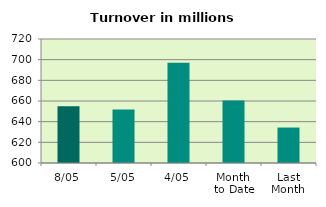
| Category | Series 0 |
|---|---|
| 8/05 | 654.845 |
| 5/05 | 651.89 |
| 4/05 | 697.137 |
| Month 
to Date | 660.577 |
| Last
Month | 634.312 |